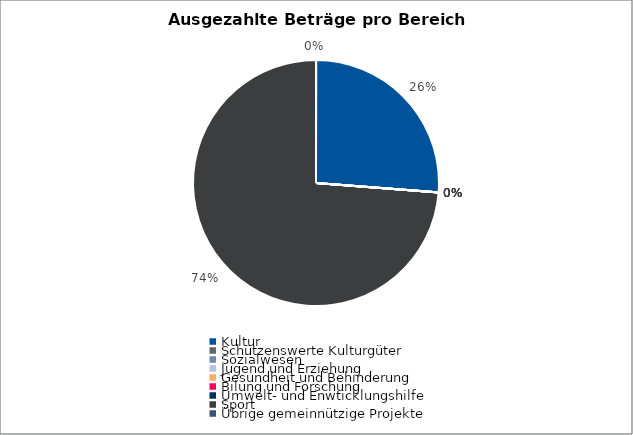
| Category | Series 0 |
|---|---|
| Kultur | 203500 |
| Schützenswerte Kulturgüter | 0 |
| Sozialwesen | 0 |
| Jugend und Erziehung | 0 |
| Gesundheit und Behinderung | 0 |
| Bilung und Forschung | 0 |
| Umwelt- und Enwticklungshilfe | 0 |
| Sport | 572771.9 |
| Übrige gemeinnützige Projekte | 0 |